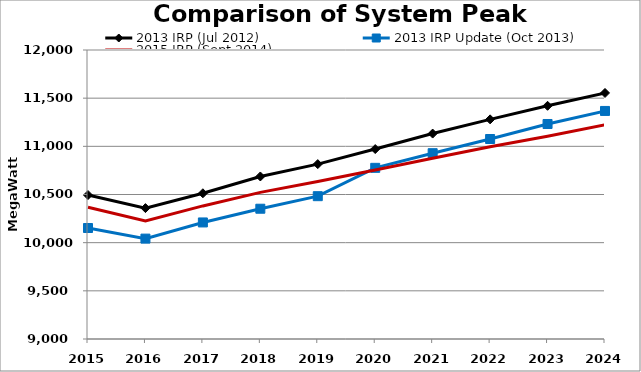
| Category | 2013 IRP (Jul 2012) | 2013 IRP Update (Oct 2013) | 2015 IRP (Sept 2014) |
|---|---|---|---|
| 2015.0 | 10494.438 | 10152.159 | 10368.343 |
| 2016.0 | 10358.752 | 10041.983 | 10224.701 |
| 2017.0 | 10512.796 | 10209.911 | 10381.458 |
| 2018.0 | 10687.093 | 10352.387 | 10522.107 |
| 2019.0 | 10815.406 | 10482.552 | 10634.546 |
| 2020.0 | 10971.77 | 10776.858 | 10754.966 |
| 2021.0 | 11132.532 | 10928.807 | 10875.659 |
| 2022.0 | 11279.984 | 11075.979 | 10995.747 |
| 2023.0 | 11420.716 | 11231.966 | 11105.431 |
| 2024.0 | 11554 | 11367.328 | 11224.307 |